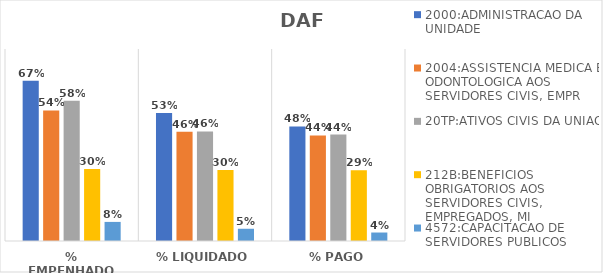
| Category | 2000:ADMINISTRACAO DA UNIDADE | 2004:ASSISTENCIA MEDICA E ODONTOLOGICA AOS SERVIDORES CIVIS, EMPR | 20TP:ATIVOS CIVIS DA UNIAO | 212B:BENEFICIOS OBRIGATORIOS AOS SERVIDORES CIVIS, EMPREGADOS, MI | 4572:CAPACITACAO DE SERVIDORES PUBLICOS FEDERAIS EM PROCESSO DE Q |
|---|---|---|---|---|---|
| % EMPENHADO | 0.668 | 0.544 | 0.584 | 0.3 | 0.08 |
| % LIQUIDADO | 0.533 | 0.455 | 0.457 | 0.296 | 0.051 |
| % PAGO | 0.477 | 0.44 | 0.444 | 0.295 | 0.035 |